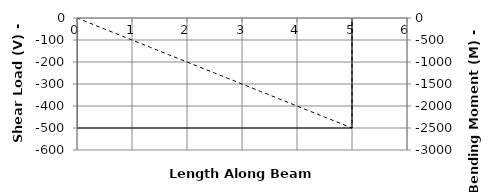
| Category | V |
|---|---|
| 0.0 | 0 |
| 0.0 | 0 |
| 1e-05 | -500 |
| 0.16666666666666666 | -500 |
| 0.3333333333333333 | -500 |
| 0.5 | -500 |
| 0.6666666666666666 | -500 |
| 0.8333333333333333 | -500 |
| 1.0 | -500 |
| 1.1666666666666665 | -500 |
| 1.3333333333333333 | -500 |
| 1.5 | -500 |
| 1.6666666666666665 | -500 |
| 1.8333333333333333 | -500 |
| 2.0 | -500 |
| 2.1666666666666665 | -500 |
| 2.333333333333333 | -500 |
| 2.5 | -500 |
| 2.6666666666666665 | -500 |
| 2.833333333333333 | -500 |
| 3.0 | -500 |
| 3.1666666666666665 | -500 |
| 3.333333333333333 | -500 |
| 3.5 | -500 |
| 3.6666666666666665 | -500 |
| 3.833333333333333 | -500 |
| 4.0 | -500 |
| 4.166666666666666 | -500 |
| 4.333333333333333 | -500 |
| 4.5 | -500 |
| 4.666666666666666 | -500 |
| 4.833333333333333 | -500 |
| 5.0 | -500 |
| 5.0000001 | 0 |